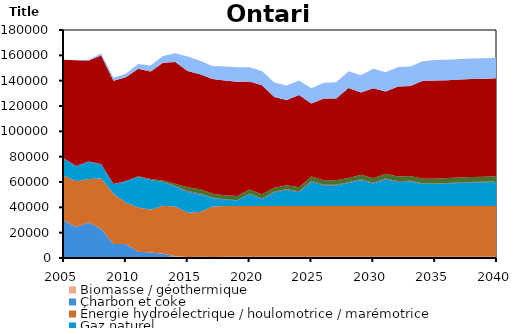
| Category | Biomasse / géothermique | Charbon et coke | Énergie hydroélectrique / houlomotrice / marémotrice | Gaz naturel | Pétrole | Solaire | Uranium | Éolien |
|---|---|---|---|---|---|---|---|---|
| 2005.0 | 807.529 | 28734.08 | 35480 | 13282.59 | 309.945 | 0 | 77969 | 26 |
| 2006.0 | 733.505 | 23808.08 | 36031.99 | 11807.7 | 309.945 | 0 | 83457 | 145 |
| 2007.0 | 598.952 | 27468.72 | 34315 | 13530.81 | 309.945 | 0 | 79750 | 494 |
| 2008.0 | 484.043 | 22638.21 | 39614.99 | 11214.3 | 182.56 | 0 | 85832 | 1400 |
| 2009.0 | 657.054 | 10461.15 | 39685.01 | 7490.896 | 215.245 | 5 | 81395.98 | 2300 |
| 2010.0 | 735.096 | 10336.62 | 32555 | 16885.54 | 73.471 | 123 | 81975 | 2800 |
| 2011.0 | 607.886 | 4329.339 | 34907 | 24281.59 | 45.67 | 398 | 84766 | 3899.999 |
| 2012.0 | 672.858 | 3596.735 | 33887 | 23380.22 | 65.78 | 842 | 84866 | 4600 |
| 2013.0 | 586.338 | 2742.243 | 37936 | 18653.16 | 45.152 | 1173 | 93102.99 | 5200 |
| 2014.0 | 1429.387 | 94.811 | 39199.48 | 15720.97 | 381.129 | 1757.707 | 96195.59 | 6900.642 |
| 2015.0 | 815.734 | 0 | 34947.93 | 16399.83 | 706.741 | 2953.841 | 91768.76 | 11395.51 |
| 2016.0 | 944.767 | 0 | 35280.38 | 14173.07 | 558.684 | 3238.468 | 90873.27 | 10581.07 |
| 2017.0 | 816.903 | 0 | 39823.02 | 6811.207 | 335.171 | 2987.91 | 90618.29 | 10181.73 |
| 2018.0 | 1057.174 | 0 | 39934.5 | 5085.19 | 360.241 | 3163.11 | 90474.5 | 11042.8 |
| 2019.0 | 1057.174 | 0 | 39943.96 | 4399.407 | 257 | 3240.196 | 90314.4 | 11375.68 |
| 2020.0 | 1057.174 | 0 | 39943.89 | 9561.932 | 257 | 3240.198 | 85235.87 | 11375.68 |
| 2021.0 | 1057.174 | 0 | 40004.74 | 5354.441 | 596.012 | 3240.198 | 86086.53 | 11375.69 |
| 2022.0 | 1057.174 | 0 | 40004.73 | 10575.02 | 596.012 | 3240.199 | 71632.63 | 11375.69 |
| 2023.0 | 1057.174 | 0 | 40004.73 | 12629.18 | 596.012 | 3240.198 | 67198.4 | 11375.68 |
| 2024.0 | 1057.174 | 0 | 40004.73 | 10833.59 | 596.012 | 3284.439 | 72918.67 | 11375.69 |
| 2025.0 | 1057.174 | 0 | 40004.72 | 19163.33 | 761.917 | 3328.675 | 57676.72 | 12036.66 |
| 2026.0 | 1057.174 | 0 | 40004.73 | 16180.22 | 674.527 | 3372.915 | 64638.73 | 12448.94 |
| 2027.0 | 1057.174 | 0 | 40004.71 | 16162.09 | 672.556 | 3417.152 | 64661.06 | 12861.23 |
| 2028.0 | 1057.174 | 0 | 40004.73 | 18083.4 | 600.102 | 3461.393 | 70915.7 | 13273.51 |
| 2029.0 | 1057.174 | 0 | 40004.7 | 20580.6 | 619.965 | 3505.632 | 64795.09 | 13698.07 |
| 2030.0 | 1057.174 | 0 | 40004.74 | 17715.74 | 597.72 | 3549.872 | 71049.72 | 15362.98 |
| 2031.0 | 1057.174 | 0 | 40004.73 | 21137.41 | 629.023 | 3594.11 | 64929.11 | 15376.99 |
| 2032.0 | 1057.174 | 0 | 40004.73 | 18961.13 | 608.413 | 3638.349 | 71183.75 | 15376.99 |
| 2033.0 | 1057.174 | 0 | 40017.87 | 19312.04 | 616.065 | 3682.588 | 71183.75 | 15376.99 |
| 2034.0 | 1057.174 | 0 | 40017.87 | 17292.44 | 435.26 | 3726.827 | 77438.39 | 15376.99 |
| 2035.0 | 1057.174 | 0 | 40038.11 | 17356.06 | 436.273 | 3771.065 | 77438.39 | 16204.18 |
| 2036.0 | 1057.174 | 0 | 39998.73 | 17789.54 | 440.224 | 3815.305 | 77190.3 | 16204.18 |
| 2037.0 | 1057.174 | 0 | 40029.17 | 18131.68 | 446.041 | 3859.543 | 77402.91 | 16204.18 |
| 2038.0 | 1057.174 | 0 | 40029.18 | 18430.36 | 450.621 | 3903.783 | 77438.39 | 16204.19 |
| 2039.0 | 1057.174 | 0 | 40049.47 | 18610.38 | 452.345 | 3948.022 | 77438.39 | 16204.19 |
| 2040.0 | 1057.174 | 0 | 40088.7 | 18883.65 | 454.158 | 3992.26 | 77438.39 | 16204.18 |